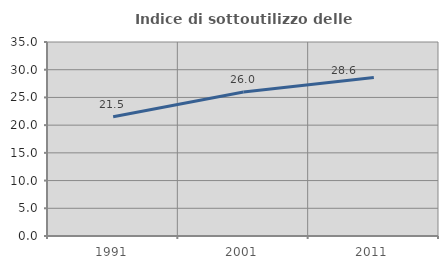
| Category | Indice di sottoutilizzo delle abitazioni  |
|---|---|
| 1991.0 | 21.528 |
| 2001.0 | 25.971 |
| 2011.0 | 28.603 |